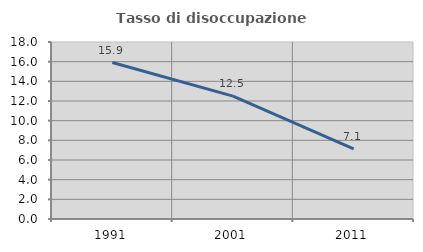
| Category | Tasso di disoccupazione giovanile  |
|---|---|
| 1991.0 | 15.909 |
| 2001.0 | 12.5 |
| 2011.0 | 7.143 |